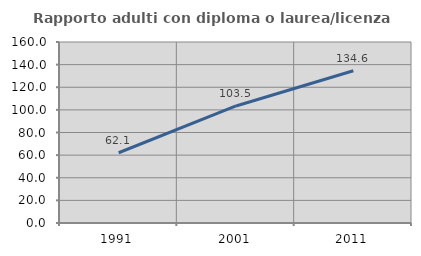
| Category | Rapporto adulti con diploma o laurea/licenza media  |
|---|---|
| 1991.0 | 62.102 |
| 2001.0 | 103.476 |
| 2011.0 | 134.594 |